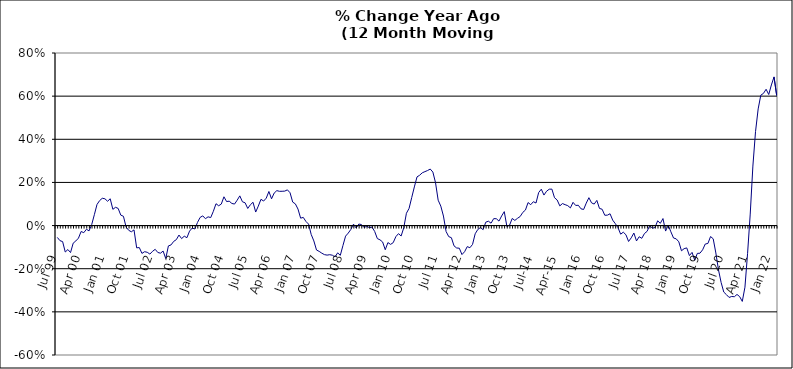
| Category | Series 0 |
|---|---|
| Jul 99 | -0.055 |
| Aug 99 | -0.07 |
| Sep 99 | -0.074 |
| Oct 99 | -0.123 |
| Nov 99 | -0.111 |
| Dec 99 | -0.125 |
| Jan 00 | -0.082 |
| Feb 00 | -0.071 |
| Mar 00 | -0.058 |
| Apr 00 | -0.027 |
| May 00 | -0.033 |
| Jun 00 | -0.017 |
| Jul 00 | -0.025 |
| Aug 00 | 0.005 |
| Sep 00 | 0.05 |
| Oct 00 | 0.098 |
| Nov 00 | 0.116 |
| Dec 00 | 0.127 |
| Jan 01 | 0.124 |
| Feb 01 | 0.113 |
| Mar 01 | 0.124 |
| Apr 01 | 0.075 |
| May 01 | 0.085 |
| Jun 01 | 0.08 |
| Jul 01 | 0.048 |
| Aug 01 | 0.043 |
| Sep 01 | -0.007 |
| Oct 01 | -0.022 |
| Nov 01 | -0.029 |
| Dec 01 | -0.02 |
| Jan 02 | -0.103 |
| Feb 02 | -0.102 |
| Mar 02 | -0.129 |
| Apr 02 | -0.121 |
| May 02 | -0.124 |
| Jun 02 | -0.132 |
| Jul 02 | -0.119 |
| Aug 02 | -0.11 |
| Sep 02 | -0.125 |
| Oct 02 | -0.128 |
| Nov 02 | -0.118 |
| Dec 02 | -0.153 |
| Jan 03 | -0.094 |
| Feb 03 | -0.09 |
| Mar 03 | -0.073 |
| Apr 03 | -0.065 |
| May 03 | -0.044 |
| Jun 03 | -0.06 |
| Jul 03 | -0.049 |
| Aug 03 | -0.056 |
| Sep 03 | -0.026 |
| Oct 03 | -0.012 |
| Nov 03 | -0.016 |
| Dec 03 | 0.014 |
| Jan 04 | 0.038 |
| Feb 04 | 0.045 |
| Mar 04 | 0.032 |
| Apr 04 | 0.041 |
| May 04 | 0.037 |
| Jun 04 | 0.066 |
| Jul 04 | 0.101 |
| Aug 04 | 0.092 |
| Sep 04 | 0.1 |
| Oct 04 | 0.133 |
| Nov 04 | 0.111 |
| Dec 04 | 0.113 |
| Jan 05 | 0.103 |
| Feb 05 | 0.1 |
| Mar 05 | 0.118 |
| Apr 05 | 0.138 |
| May 05 | 0.11 |
| Jun 05 | 0.106 |
| Jul 05 | 0.079 |
| Aug 05 | 0.097 |
| Sep 05 | 0.108 |
| Oct 05 | 0.063 |
| Nov 05 | 0.09 |
| Dec 05 | 0.122 |
| Jan 06 | 0.114 |
| Feb 06 | 0.127 |
| Mar 06 | 0.158 |
| Apr 06 | 0.124 |
| May 06 | 0.151 |
| Jun 06 | 0.162 |
| Jul 06 | 0.159 |
| Aug 06 | 0.159 |
| Sep 06 | 0.16 |
| Oct 06 | 0.166 |
| Nov 06 | 0.152 |
| Dec 06 | 0.109 |
| Jan 07 | 0.101 |
| Feb 07 | 0.076 |
| Mar 07 | 0.034 |
| Apr 07 | 0.038 |
| May 07 | 0.019 |
| Jun 07 | 0.007 |
| Jul 07 | -0.041 |
| Aug 07 | -0.071 |
| Sep 07 | -0.113 |
| Oct 07 | -0.12 |
| Nov 07 | -0.128 |
| Dec 07 | -0.135 |
| Jan 08 | -0.137 |
| Feb 08 | -0.135 |
| Mar 08 | -0.137 |
| Apr 08 | -0.145 |
| May 08 | -0.126 |
| Jun 08 | -0.138 |
| Jul 08 | -0.093 |
| Aug 08 | -0.049 |
| Sep-08 | -0.035 |
| Oct 08 | -0.018 |
| Nov 08 | 0.007 |
| Dec 08 | -0.011 |
| Jan 09 | 0.007 |
| Feb 09 | 0.005 |
| Mar 09 | -0.009 |
| Apr 09 | -0.003 |
| May 09 | -0.01 |
| Jun 09 | -0.007 |
| Jul 09 | -0.027 |
| Aug 09 | -0.06 |
| Sep 09 | -0.066 |
| Oct 09 | -0.076 |
| Nov 09 | -0.112 |
| Dec 09 | -0.079 |
| Jan 10 | -0.087 |
| Feb 10 | -0.079 |
| Mar 10 | -0.052 |
| Apr 10 | -0.037 |
| May 10 | -0.048 |
| Jun 10 | -0.01 |
| Jul 10 | 0.057 |
| Aug 10 | 0.08 |
| Sep 10 | 0.13 |
| Oct 10 | 0.179 |
| Nov 10 | 0.226 |
| Dec 10 | 0.233 |
| Jan 11 | 0.245 |
| Feb 11 | 0.25 |
| Mar 11 | 0.255 |
| Apr 11 | 0.262 |
| May 11 | 0.248 |
| Jun 11 | 0.199 |
| Jul 11 | 0.118 |
| Aug 11 | 0.09 |
| Sep 11 | 0.044 |
| Oct 11 | -0.028 |
| Nov 11 | -0.051 |
| Dec 11 | -0.056 |
| Jan 12 | -0.094 |
| Feb 12 | -0.104 |
| Mar 12 | -0.105 |
| Apr 12 | -0.134 |
| May 12 | -0.121 |
| Jun 12 | -0.098 |
| Jul 12 | -0.103 |
| Aug 12 | -0.087 |
| Sep 12 | -0.038 |
| Oct 12 | -0.018 |
| Nov 12 | -0.009 |
| Dec 12 | -0.019 |
| Jan 13 | 0.016 |
| Feb-13 | 0.02 |
| Mar-13 | 0.011 |
| Apr 13 | 0.032 |
| May 13 | 0.032 |
| Jun-13 | 0.021 |
| Jul 13 | 0.045 |
| Aug 13 | 0.065 |
| Sep 13 | -0.005 |
| Oct 13 | 0.002 |
| Nov 13 | 0.033 |
| Dec 13 | 0.024 |
| Jan 14 | 0.034 |
| Feb-14 | 0.042 |
| Mar 14 | 0.061 |
| Apr 14 | 0.072 |
| May 14 | 0.107 |
| Jun 14 | 0.097 |
| Jul-14 | 0.111 |
| Aug-14 | 0.105 |
| Sep 14 | 0.153 |
| Oct 14 | 0.169 |
| Nov 14 | 0.141 |
| Dec 14 | 0.159 |
| Jan 15 | 0.169 |
| Feb 15 | 0.169 |
| Mar 15 | 0.129 |
| Apr-15 | 0.118 |
| May 15 | 0.091 |
| Jun-15 | 0.102 |
| Jul 15 | 0.097 |
| Aug 15 | 0.092 |
| Sep 15 | 0.082 |
| Oct 15 | 0.108 |
| Nov 15 | 0.093 |
| Dec 15 | 0.094 |
| Jan 16 | 0.078 |
| Feb 16 | 0.075 |
| Mar 16 | 0.104 |
| Apr 16 | 0.129 |
| May 16 | 0.105 |
| Jun 16 | 0.1 |
| Jul 16 | 0.117 |
| Aug 16 | 0.08 |
| Sep 16 | 0.076 |
| Oct 16 | 0.048 |
| Nov 16 | 0.048 |
| Dec 16 | 0.055 |
| Jan 17 | 0.025 |
| Feb 17 | 0.009 |
| Mar 17 | -0.01 |
| Apr 17 | -0.04 |
| May 17 | -0.031 |
| Jun 17 | -0.042 |
| Jul 17 | -0.074 |
| Aug 17 | -0.057 |
| Sep 17 | -0.035 |
| Oct 17 | -0.071 |
| Nov 17 | -0.052 |
| Dec 17 | -0.059 |
| Jan 18 | -0.037 |
| Feb 18 | -0.027 |
| Mar 18 | 0 |
| Apr 18 | -0.012 |
| May 18 | -0.009 |
| Jun 18 | 0.022 |
| Jul 18 | 0.01 |
| Aug 18 | 0.033 |
| Sep 18 | -0.025 |
| Oct 18 | 0.002 |
| Nov 18 | -0.029 |
| Dec 18 | -0.058 |
| Jan 19 | -0.061 |
| Feb 19 | -0.075 |
| Mar 19 | -0.117 |
| Apr 19 | -0.107 |
| May 19 | -0.104 |
| Jun 19 | -0.139 |
| Jul 19 | -0.124 |
| Aug 19 | -0.16 |
| Sep 19 | -0.129 |
| Oct 19 | -0.128 |
| Nov 19 | -0.112 |
| Dec 19 | -0.085 |
| Jan 20 | -0.083 |
| Feb 20 | -0.051 |
| Mar 20 | -0.061 |
| Apr 20 | -0.127 |
| May 20 | -0.206 |
| Jun 20 | -0.264 |
| Jul 20 | -0.308 |
| Aug 20 | -0.32 |
| Sep 20 | -0.333 |
| Oct 20 | -0.329 |
| Nov 20 | -0.33 |
| Dec 20 | -0.319 |
| Jan 21 | -0.329 |
| Feb 21 | -0.352 |
| Mar 21 | -0.286 |
| Apr 21 | -0.129 |
| May 21 | 0.053 |
| Jun 21 | 0.276 |
| Jul 21 | 0.435 |
| Aug 21 | 0.541 |
| Sep 21 | 0.604 |
| Oct 21 | 0.613 |
| Nov 21 | 0.632 |
| Dec 21 | 0.608 |
| Jan 22 | 0.652 |
| Feb 22 | 0.689 |
| Mar 22 | 0.603 |